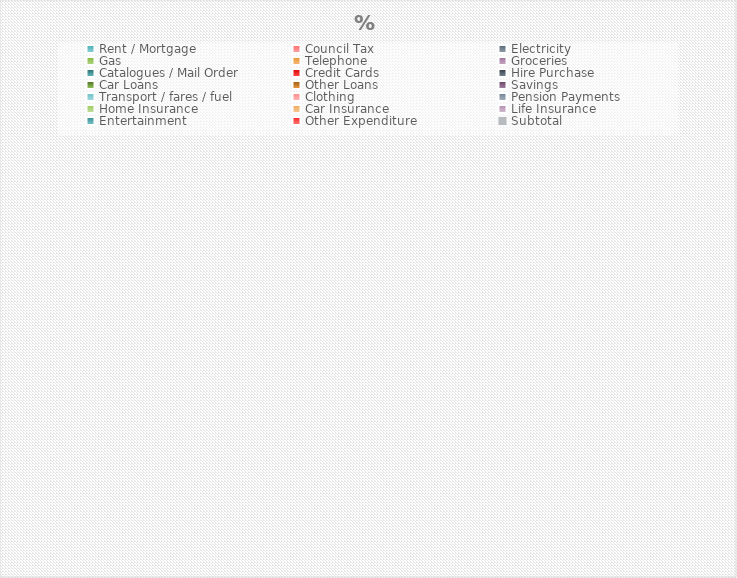
| Category | Monthly | % |
|---|---|---|
| Rent / Mortgage  |  | 0 |
| Council Tax  |  | 0 |
| Electricity  |  | 0 |
| Gas |  | 0 |
| Telephone  |  | 0 |
| Groceries  |  | 0 |
| Catalogues / Mail Order |  | 0 |
| Credit Cards |  | 0 |
| Hire Purchase  |  | 0 |
| Car Loans  |  | 0 |
| Other Loans  |  | 0 |
| Savings  |  | 0 |
| Transport / fares / fuel  |  | 0 |
| Clothing  |  | 0 |
| Pension Payments  |  | 0 |
| Home Insurance  |  | 0 |
| Car Insurance  |  | 0 |
| Life Insurance  |  | 0 |
| Entertainment  |  | 0 |
| Other Expenditure  |  | 0 |